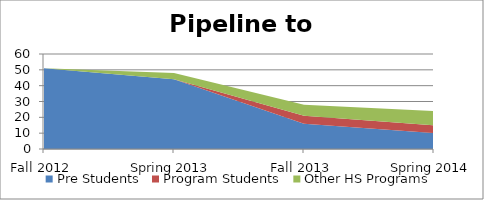
| Category | Pre Students | Program Students | Other HS Programs |
|---|---|---|---|
| Fall 2012 | 51 | 0 | 0 |
| Spring 2013 | 44 | 0 | 4 |
| Fall 2013 | 16 | 5 | 7 |
| Spring 2014 | 10 | 5 | 9 |